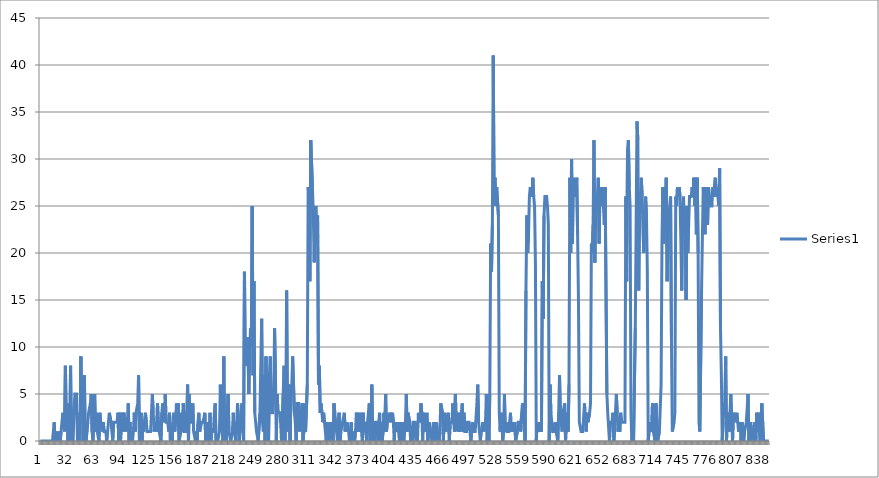
| Category | Series 0 |
|---|---|
| 0 | 0 |
| 1 | 0 |
| 2 | 0 |
| 3 | 0 |
| 4 | 0 |
| 5 | 0 |
| 6 | 0 |
| 7 | 0 |
| 8 | 0 |
| 9 | 0 |
| 10 | 0 |
| 11 | 0 |
| 12 | 0 |
| 13 | 0 |
| 14 | 0 |
| 15 | 0 |
| 16 | 2 |
| 17 | 0 |
| 18 | 1 |
| 19 | 1 |
| 20 | 0 |
| 21 | 1 |
| 22 | 1 |
| 23 | 0 |
| 24 | 1 |
| 25 | 1 |
| 26 | 3 |
| 27 | 2 |
| 28 | 1 |
| 29 | 8 |
| 30 | 2 |
| 31 | 4 |
| 32 | 0 |
| 33 | 3 |
| 34 | 0 |
| 35 | 8 |
| 36 | 0 |
| 37 | 0 |
| 38 | 0 |
| 39 | 3 |
| 40 | 5 |
| 41 | 5 |
| 42 | 5 |
| 43 | 0 |
| 44 | 3 |
| 45 | 1 |
| 46 | 0 |
| 47 | 9 |
| 48 | 3 |
| 49 | 6 |
| 50 | 0 |
| 51 | 7 |
| 52 | 1 |
| 53 | 0 |
| 54 | 0 |
| 55 | 2 |
| 56 | 3 |
| 57 | 3 |
| 58 | 4 |
| 59 | 5 |
| 60 | 1 |
| 61 | 0 |
| 62 | 2 |
| 63 | 5 |
| 64 | 1 |
| 65 | 3 |
| 66 | 1 |
| 67 | 1 |
| 68 | 0 |
| 69 | 3 |
| 70 | 2 |
| 71 | 2 |
| 72 | 1 |
| 73 | 2 |
| 74 | 1 |
| 75 | 1 |
| 76 | 1 |
| 77 | 0 |
| 78 | 1 |
| 79 | 2 |
| 80 | 3 |
| 81 | 3 |
| 82 | 2 |
| 83 | 1 |
| 84 | 0 |
| 85 | 2 |
| 86 | 2 |
| 87 | 2 |
| 88 | 2 |
| 89 | 2 |
| 90 | 3 |
| 91 | 0 |
| 92 | 3 |
| 93 | 0 |
| 94 | 0 |
| 95 | 3 |
| 96 | 1 |
| 97 | 3 |
| 98 | 2 |
| 99 | 1 |
| 100 | 1 |
| 101 | 2 |
| 102 | 4 |
| 103 | 0 |
| 104 | 2 |
| 105 | 0 |
| 106 | 0 |
| 107 | 0 |
| 108 | 1 |
| 109 | 3 |
| 110 | 1 |
| 111 | 3 |
| 112 | 3 |
| 113 | 4 |
| 114 | 7 |
| 115 | 0 |
| 116 | 2 |
| 117 | 3 |
| 118 | 0 |
| 119 | 2 |
| 120 | 1 |
| 121 | 1 |
| 122 | 3 |
| 123 | 2 |
| 124 | 1 |
| 125 | 1 |
| 126 | 1 |
| 127 | 1 |
| 128 | 1 |
| 129 | 1 |
| 130 | 5 |
| 131 | 3 |
| 132 | 1 |
| 133 | 1 |
| 134 | 2 |
| 135 | 1 |
| 136 | 4 |
| 137 | 2 |
| 138 | 1 |
| 139 | 1 |
| 140 | 0 |
| 141 | 3 |
| 142 | 4 |
| 143 | 2 |
| 144 | 3 |
| 145 | 5 |
| 146 | 2 |
| 147 | 2 |
| 148 | 2 |
| 149 | 1 |
| 150 | 3 |
| 151 | 0 |
| 152 | 1 |
| 153 | 0 |
| 154 | 2 |
| 155 | 3 |
| 156 | 1 |
| 157 | 2 |
| 158 | 4 |
| 159 | 3 |
| 160 | 4 |
| 161 | 0 |
| 162 | 0 |
| 163 | 1 |
| 164 | 3 |
| 165 | 1 |
| 166 | 4 |
| 167 | 1 |
| 168 | 1 |
| 169 | 1 |
| 170 | 1 |
| 171 | 6 |
| 172 | 0 |
| 173 | 5 |
| 174 | 2 |
| 175 | 2 |
| 176 | 2 |
| 177 | 4 |
| 178 | 1 |
| 179 | 1 |
| 180 | 0 |
| 181 | 1 |
| 182 | 0 |
| 183 | 2 |
| 184 | 3 |
| 185 | 1 |
| 186 | 1 |
| 187 | 2 |
| 188 | 2 |
| 189 | 2 |
| 190 | 2 |
| 191 | 3 |
| 192 | 0 |
| 193 | 2 |
| 194 | 1 |
| 195 | 0 |
| 196 | 1 |
| 197 | 3 |
| 198 | 0 |
| 199 | 1 |
| 200 | 1 |
| 201 | 1 |
| 202 | 3 |
| 203 | 4 |
| 204 | 0 |
| 205 | 0 |
| 206 | 0 |
| 207 | 0 |
| 208 | 1 |
| 209 | 6 |
| 210 | 2 |
| 211 | 4 |
| 212 | 0 |
| 213 | 9 |
| 214 | 0 |
| 215 | 3 |
| 216 | 0 |
| 217 | 0 |
| 218 | 5 |
| 219 | 1 |
| 220 | 1 |
| 221 | 0 |
| 222 | 0 |
| 223 | 1 |
| 224 | 3 |
| 225 | 1 |
| 226 | 1 |
| 227 | 0 |
| 228 | 2 |
| 229 | 4 |
| 230 | 2 |
| 231 | 0 |
| 232 | 2 |
| 233 | 2 |
| 234 | 4 |
| 235 | 1 |
| 236 | 0 |
| 237 | 18 |
| 238 | 8 |
| 239 | 9 |
| 240 | 8 |
| 241 | 11 |
| 242 | 5 |
| 243 | 9 |
| 244 | 12 |
| 245 | 10 |
| 246 | 25 |
| 247 | 7 |
| 248 | 17 |
| 249 | 3 |
| 250 | 3 |
| 251 | 1 |
| 252 | 1 |
| 253 | 0 |
| 254 | 0 |
| 255 | 3 |
| 256 | 3 |
| 257 | 13 |
| 258 | 2 |
| 259 | 1 |
| 260 | 7 |
| 261 | 0 |
| 262 | 9 |
| 263 | 3 |
| 264 | 6 |
| 265 | 0 |
| 266 | 7 |
| 267 | 9 |
| 268 | 3 |
| 269 | 3 |
| 270 | 3 |
| 271 | 5 |
| 272 | 12 |
| 273 | 7 |
| 274 | 0 |
| 275 | 5 |
| 276 | 3 |
| 277 | 3 |
| 278 | 3 |
| 279 | 2 |
| 280 | 0 |
| 281 | 0 |
| 282 | 5 |
| 283 | 8 |
| 284 | 0 |
| 285 | 3 |
| 286 | 16 |
| 287 | 2 |
| 288 | 1 |
| 289 | 6 |
| 290 | 0 |
| 291 | 5 |
| 292 | 6 |
| 293 | 9 |
| 294 | 9 |
| 295 | 3 |
| 296 | 2 |
| 297 | 0 |
| 298 | 4 |
| 299 | 4 |
| 300 | 4 |
| 301 | 1 |
| 302 | 1 |
| 303 | 3 |
| 304 | 4 |
| 305 | 0 |
| 306 | 1 |
| 307 | 4 |
| 308 | 1 |
| 309 | 1 |
| 310 | 6 |
| 311 | 27 |
| 312 | 26 |
| 313 | 17 |
| 314 | 32 |
| 315 | 32 |
| 316 | 27 |
| 317 | 24 |
| 318 | 19 |
| 319 | 24 |
| 320 | 25 |
| 321 | 21 |
| 322 | 24 |
| 323 | 6 |
| 324 | 8 |
| 325 | 3 |
| 326 | 4 |
| 327 | 3 |
| 328 | 2 |
| 329 | 3 |
| 330 | 2 |
| 331 | 2 |
| 332 | 0 |
| 333 | 2 |
| 334 | 1 |
| 335 | 1 |
| 336 | 0 |
| 337 | 2 |
| 338 | 1 |
| 339 | 1 |
| 340 | 0 |
| 341 | 4 |
| 342 | 3 |
| 343 | 3 |
| 344 | 1 |
| 345 | 0 |
| 346 | 0 |
| 347 | 3 |
| 348 | 0 |
| 349 | 1 |
| 350 | 1 |
| 351 | 2 |
| 352 | 2 |
| 353 | 3 |
| 354 | 1 |
| 355 | 1 |
| 356 | 2 |
| 357 | 2 |
| 358 | 1 |
| 359 | 0 |
| 360 | 1 |
| 361 | 2 |
| 362 | 0 |
| 363 | 1 |
| 364 | 1 |
| 365 | 0 |
| 366 | 1 |
| 367 | 3 |
| 368 | 1 |
| 369 | 3 |
| 370 | 1 |
| 371 | 2 |
| 372 | 3 |
| 373 | 3 |
| 374 | 0 |
| 375 | 3 |
| 376 | 1 |
| 377 | 2 |
| 378 | 2 |
| 379 | 0 |
| 380 | 2 |
| 381 | 3 |
| 382 | 4 |
| 383 | 0 |
| 384 | 1 |
| 385 | 6 |
| 386 | 0 |
| 387 | 1 |
| 388 | 0 |
| 389 | 2 |
| 390 | 2 |
| 391 | 2 |
| 392 | 0 |
| 393 | 2 |
| 394 | 3 |
| 395 | 0 |
| 396 | 2 |
| 397 | 0 |
| 398 | 1 |
| 399 | 3 |
| 400 | 1 |
| 401 | 5 |
| 402 | 1 |
| 403 | 2 |
| 404 | 2 |
| 405 | 3 |
| 406 | 2 |
| 407 | 3 |
| 408 | 2 |
| 409 | 3 |
| 410 | 2 |
| 411 | 0 |
| 412 | 2 |
| 413 | 1 |
| 414 | 1 |
| 415 | 2 |
| 416 | 1 |
| 417 | 0 |
| 418 | 2 |
| 419 | 0 |
| 420 | 1 |
| 421 | 2 |
| 422 | 0 |
| 423 | 1 |
| 424 | 2 |
| 425 | 5 |
| 426 | 1 |
| 427 | 3 |
| 428 | 3 |
| 429 | 2 |
| 430 | 0 |
| 431 | 0 |
| 432 | 0 |
| 433 | 2 |
| 434 | 2 |
| 435 | 2 |
| 436 | 0 |
| 437 | 0 |
| 438 | 0 |
| 439 | 3 |
| 440 | 3 |
| 441 | 2 |
| 442 | 4 |
| 443 | 3 |
| 444 | 0 |
| 445 | 3 |
| 446 | 1 |
| 447 | 2 |
| 448 | 2 |
| 449 | 3 |
| 450 | 0 |
| 451 | 1 |
| 452 | 2 |
| 453 | 1 |
| 454 | 1 |
| 455 | 0 |
| 456 | 1 |
| 457 | 2 |
| 458 | 1 |
| 459 | 0 |
| 460 | 2 |
| 461 | 1 |
| 462 | 1 |
| 463 | 0 |
| 464 | 1 |
| 465 | 4 |
| 466 | 4 |
| 467 | 3 |
| 468 | 0 |
| 469 | 2 |
| 470 | 3 |
| 471 | 1 |
| 472 | 2 |
| 473 | 2 |
| 474 | 3 |
| 475 | 0 |
| 476 | 2 |
| 477 | 2 |
| 478 | 2 |
| 479 | 4 |
| 480 | 2 |
| 481 | 1 |
| 482 | 5 |
| 483 | 2 |
| 484 | 2 |
| 485 | 1 |
| 486 | 3 |
| 487 | 1 |
| 488 | 2 |
| 489 | 2 |
| 490 | 4 |
| 491 | 1 |
| 492 | 3 |
| 493 | 1 |
| 494 | 1 |
| 495 | 1 |
| 496 | 2 |
| 497 | 2 |
| 498 | 2 |
| 499 | 2 |
| 500 | 0 |
| 501 | 1 |
| 502 | 2 |
| 503 | 1 |
| 504 | 1 |
| 505 | 1 |
| 506 | 1 |
| 507 | 4 |
| 508 | 6 |
| 509 | 2 |
| 510 | 1 |
| 511 | 0 |
| 512 | 1 |
| 513 | 1 |
| 514 | 2 |
| 515 | 1 |
| 516 | 1 |
| 517 | 2 |
| 518 | 5 |
| 519 | 0 |
| 520 | 2 |
| 521 | 0 |
| 522 | 5 |
| 523 | 21 |
| 524 | 18 |
| 525 | 23 |
| 526 | 41 |
| 527 | 26 |
| 528 | 28 |
| 529 | 25 |
| 530 | 27 |
| 531 | 27 |
| 532 | 24 |
| 533 | 3 |
| 534 | 1 |
| 535 | 3 |
| 536 | 2 |
| 537 | 0 |
| 538 | 1 |
| 539 | 5 |
| 540 | 1 |
| 541 | 2 |
| 542 | 1 |
| 543 | 1 |
| 544 | 1 |
| 545 | 2 |
| 546 | 3 |
| 547 | 1 |
| 548 | 2 |
| 549 | 2 |
| 550 | 1 |
| 551 | 2 |
| 552 | 0 |
| 553 | 0 |
| 554 | 1 |
| 555 | 2 |
| 556 | 2 |
| 557 | 2 |
| 558 | 1 |
| 559 | 3 |
| 560 | 4 |
| 561 | 2 |
| 562 | 4 |
| 563 | 0 |
| 564 | 16 |
| 565 | 24 |
| 566 | 20 |
| 567 | 22 |
| 568 | 26 |
| 569 | 27 |
| 570 | 27 |
| 571 | 26 |
| 572 | 28 |
| 573 | 26 |
| 574 | 25 |
| 575 | 19 |
| 576 | 0 |
| 577 | 2 |
| 578 | 2 |
| 579 | 1 |
| 580 | 1 |
| 581 | 2 |
| 582 | 1 |
| 583 | 17 |
| 584 | 13 |
| 585 | 24 |
| 586 | 26 |
| 587 | 26 |
| 588 | 26 |
| 589 | 25 |
| 590 | 23 |
| 591 | 0 |
| 592 | 6 |
| 593 | 3 |
| 594 | 2 |
| 595 | 1 |
| 596 | 1 |
| 597 | 1 |
| 598 | 2 |
| 599 | 1 |
| 600 | 1 |
| 601 | 0 |
| 602 | 3 |
| 603 | 7 |
| 604 | 3 |
| 605 | 3 |
| 606 | 1 |
| 607 | 3 |
| 608 | 3 |
| 609 | 4 |
| 610 | 0 |
| 611 | 2 |
| 612 | 3 |
| 613 | 1 |
| 614 | 6 |
| 615 | 28 |
| 616 | 20 |
| 617 | 30 |
| 618 | 21 |
| 619 | 28 |
| 620 | 26 |
| 621 | 27 |
| 622 | 26 |
| 623 | 28 |
| 624 | 22 |
| 625 | 15 |
| 626 | 2 |
| 627 | 2 |
| 628 | 1 |
| 629 | 1 |
| 630 | 1 |
| 631 | 1 |
| 632 | 4 |
| 633 | 2 |
| 634 | 1 |
| 635 | 3 |
| 636 | 2 |
| 637 | 2 |
| 638 | 3 |
| 639 | 4 |
| 640 | 21 |
| 641 | 20 |
| 642 | 23 |
| 643 | 32 |
| 644 | 19 |
| 645 | 25 |
| 646 | 25 |
| 647 | 26 |
| 648 | 28 |
| 649 | 21 |
| 650 | 27 |
| 651 | 26 |
| 652 | 25 |
| 653 | 27 |
| 654 | 25 |
| 655 | 23 |
| 656 | 27 |
| 657 | 27 |
| 658 | 5 |
| 659 | 3 |
| 660 | 3 |
| 661 | 0 |
| 662 | 2 |
| 663 | 2 |
| 664 | 2 |
| 665 | 3 |
| 666 | 0 |
| 667 | 1 |
| 668 | 3 |
| 669 | 5 |
| 670 | 3 |
| 671 | 1 |
| 672 | 2 |
| 673 | 1 |
| 674 | 3 |
| 675 | 2 |
| 676 | 2 |
| 677 | 2 |
| 678 | 2 |
| 679 | 2 |
| 680 | 26 |
| 681 | 17 |
| 682 | 31 |
| 683 | 32 |
| 684 | 27 |
| 685 | 25 |
| 686 | 3 |
| 687 | 0 |
| 688 | 1 |
| 689 | 0 |
| 690 | 0 |
| 691 | 12 |
| 692 | 12 |
| 693 | 34 |
| 694 | 32 |
| 695 | 16 |
| 696 | 25 |
| 697 | 26 |
| 698 | 28 |
| 699 | 26 |
| 700 | 22 |
| 701 | 20 |
| 702 | 24 |
| 703 | 26 |
| 704 | 24 |
| 705 | 18 |
| 706 | 0 |
| 707 | 0 |
| 708 | 2 |
| 709 | 2 |
| 710 | 1 |
| 711 | 4 |
| 712 | 1 |
| 713 | 1 |
| 714 | 0 |
| 715 | 4 |
| 716 | 4 |
| 717 | 0 |
| 718 | 0 |
| 719 | 1 |
| 720 | 1 |
| 721 | 6 |
| 722 | 21 |
| 723 | 27 |
| 724 | 21 |
| 725 | 27 |
| 726 | 24 |
| 727 | 28 |
| 728 | 17 |
| 729 | 21 |
| 730 | 24 |
| 731 | 24 |
| 732 | 26 |
| 733 | 11 |
| 734 | 1 |
| 735 | 1 |
| 736 | 2 |
| 737 | 3 |
| 738 | 26 |
| 739 | 25 |
| 740 | 27 |
| 741 | 26 |
| 742 | 27 |
| 743 | 26 |
| 744 | 26 |
| 745 | 16 |
| 746 | 25 |
| 747 | 26 |
| 748 | 22 |
| 749 | 24 |
| 750 | 15 |
| 751 | 25 |
| 752 | 20 |
| 753 | 23 |
| 754 | 26 |
| 755 | 26 |
| 756 | 26 |
| 757 | 27 |
| 758 | 26 |
| 759 | 28 |
| 760 | 25 |
| 761 | 28 |
| 762 | 22 |
| 763 | 28 |
| 764 | 20 |
| 765 | 2 |
| 766 | 1 |
| 767 | 1 |
| 768 | 16 |
| 769 | 22 |
| 770 | 27 |
| 771 | 25 |
| 772 | 22 |
| 773 | 27 |
| 774 | 26 |
| 775 | 23 |
| 776 | 27 |
| 777 | 27 |
| 778 | 25 |
| 779 | 25 |
| 780 | 25 |
| 781 | 27 |
| 782 | 26 |
| 783 | 26 |
| 784 | 28 |
| 785 | 26 |
| 786 | 27 |
| 787 | 26 |
| 788 | 25 |
| 789 | 29 |
| 790 | 12 |
| 791 | 7 |
| 792 | 0 |
| 793 | 2 |
| 794 | 4 |
| 795 | 3 |
| 796 | 9 |
| 797 | 0 |
| 798 | 3 |
| 799 | 3 |
| 800 | 1 |
| 801 | 3 |
| 802 | 5 |
| 803 | 2 |
| 804 | 0 |
| 805 | 3 |
| 806 | 3 |
| 807 | 2 |
| 808 | 2 |
| 809 | 3 |
| 810 | 2 |
| 811 | 1 |
| 812 | 1 |
| 813 | 2 |
| 814 | 0 |
| 815 | 2 |
| 816 | 1 |
| 817 | 0 |
| 818 | 1 |
| 819 | 1 |
| 820 | 2 |
| 821 | 2 |
| 822 | 5 |
| 823 | 0 |
| 824 | 1 |
| 825 | 2 |
| 826 | 2 |
| 827 | 0 |
| 828 | 1 |
| 829 | 1 |
| 830 | 2 |
| 831 | 0 |
| 832 | 3 |
| 833 | 1 |
| 834 | 3 |
| 835 | 1 |
| 836 | 0 |
| 837 | 0 |
| 838 | 4 |
| 839 | 4 |
| 840 | 0 |
| 841 | 0 |
| 842 | 0 |
| 843 | 0 |
| 844 | 0 |
| 845 | 0 |
| 846 | 0 |
| 847 | 0 |